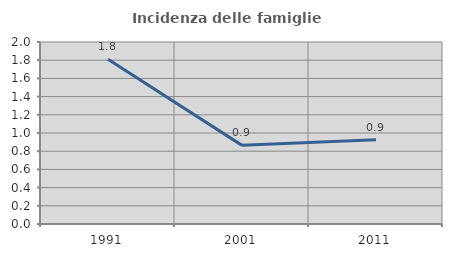
| Category | Incidenza delle famiglie numerose |
|---|---|
| 1991.0 | 1.811 |
| 2001.0 | 0.864 |
| 2011.0 | 0.925 |